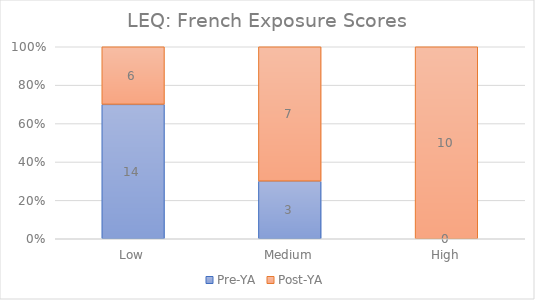
| Category | Pre-YA | Post-YA |
|---|---|---|
| Low | 14 | 6 |
| Medium | 3 | 7 |
| High | 0 | 10 |